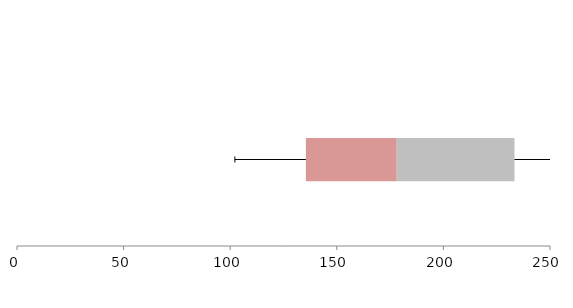
| Category | Series 1 | Series 2 | Series 3 |
|---|---|---|---|
| 0 | 135.507 | 42.607 | 55.223 |